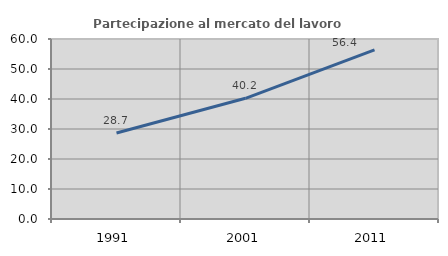
| Category | Partecipazione al mercato del lavoro  femminile |
|---|---|
| 1991.0 | 28.667 |
| 2001.0 | 40.237 |
| 2011.0 | 56.398 |